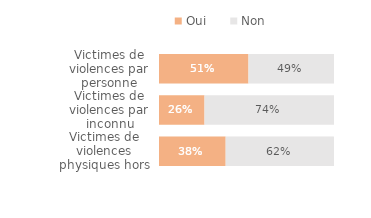
| Category | Oui | Non |
|---|---|---|
| Victimes de violences physiques hors ménage | 0.381 | 0.619 |
| Victimes de violences par inconnu | 0.26 | 0.74 |
| Victimes de violences par personne connue hors ménage | 0.511 | 0.489 |